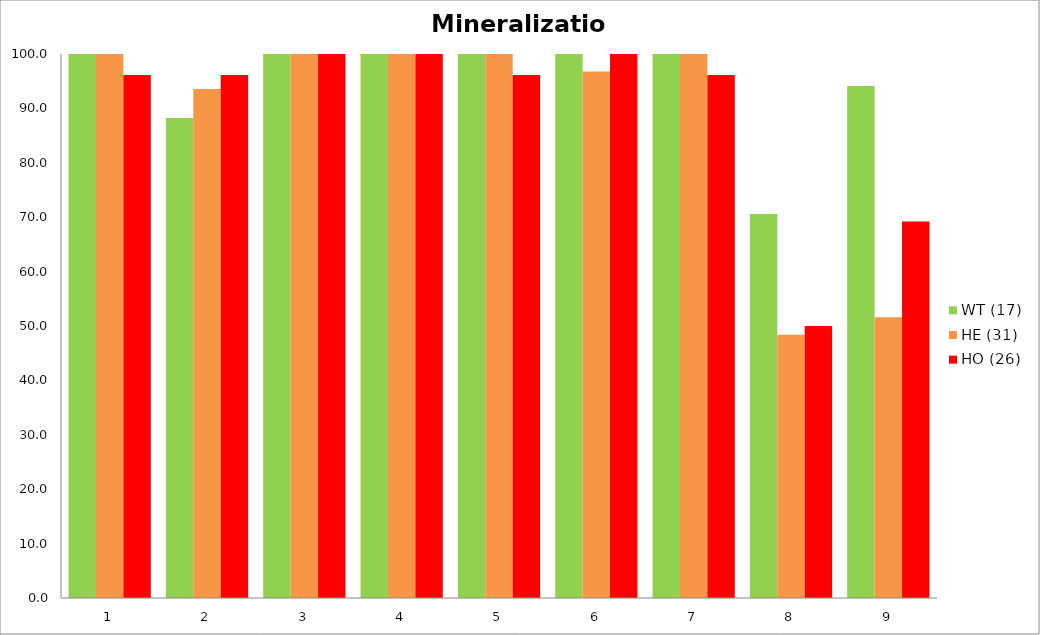
| Category | WT (17) | HE (31) | HO (26) |
|---|---|---|---|
| 0 | 100 | 100 | 96.154 |
| 1 | 88.235 | 93.548 | 96.154 |
| 2 | 100 | 100 | 100 |
| 3 | 100 | 100 | 100 |
| 4 | 100 | 100 | 96.154 |
| 5 | 100 | 96.774 | 100 |
| 6 | 100 | 100 | 96.154 |
| 7 | 70.588 | 48.387 | 50 |
| 8 | 94.118 | 51.613 | 69.231 |